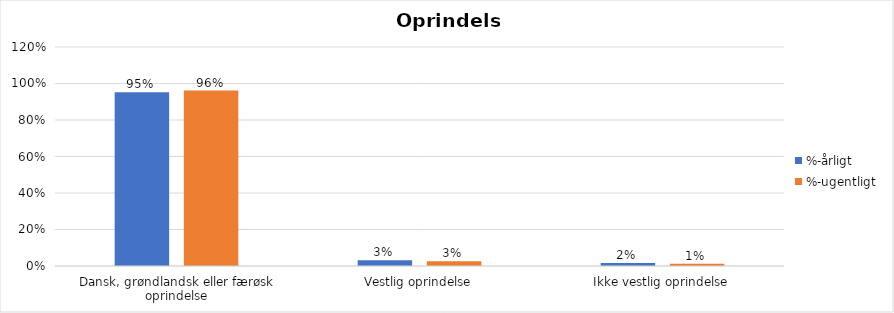
| Category | %-årligt | %-ugentligt |
|---|---|---|
| Dansk, grøndlandsk eller færøsk oprindelse | 0.952 | 0.962 |
| Vestlig oprindelse | 0.031 | 0.026 |
| Ikke vestlig oprindelse | 0.017 | 0.012 |